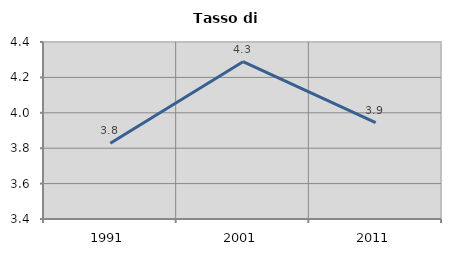
| Category | Tasso di disoccupazione   |
|---|---|
| 1991.0 | 3.828 |
| 2001.0 | 4.289 |
| 2011.0 | 3.945 |